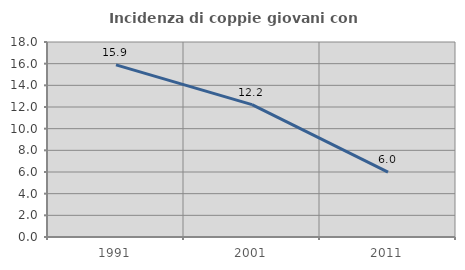
| Category | Incidenza di coppie giovani con figli |
|---|---|
| 1991.0 | 15.892 |
| 2001.0 | 12.219 |
| 2011.0 | 5.99 |